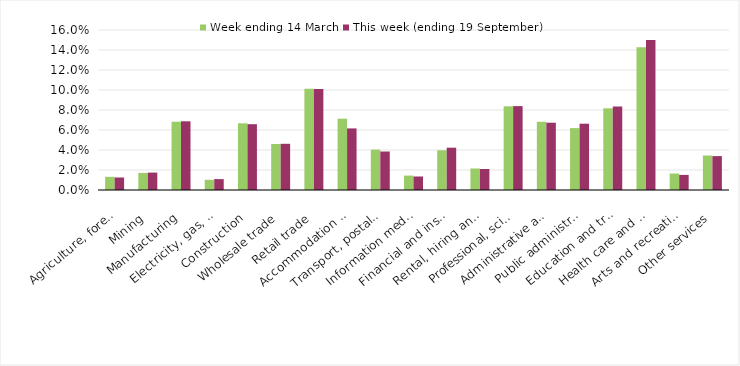
| Category | Week ending 14 March | This week (ending 19 September) |
|---|---|---|
| Agriculture, forestry and fishing | 0.013 | 0.012 |
| Mining | 0.017 | 0.017 |
| Manufacturing | 0.068 | 0.069 |
| Electricity, gas, water and waste services | 0.01 | 0.011 |
| Construction | 0.067 | 0.066 |
| Wholesale trade | 0.046 | 0.046 |
| Retail trade | 0.101 | 0.101 |
| Accommodation and food services | 0.071 | 0.062 |
| Transport, postal and warehousing | 0.04 | 0.038 |
| Information media and telecommunications | 0.014 | 0.014 |
| Financial and insurance services | 0.04 | 0.042 |
| Rental, hiring and real estate services | 0.022 | 0.021 |
| Professional, scientific and technical services | 0.084 | 0.084 |
| Administrative and support services | 0.068 | 0.067 |
| Public administration and safety | 0.062 | 0.066 |
| Education and training | 0.082 | 0.084 |
| Health care and social assistance | 0.143 | 0.15 |
| Arts and recreation services | 0.016 | 0.015 |
| Other services | 0.034 | 0.034 |